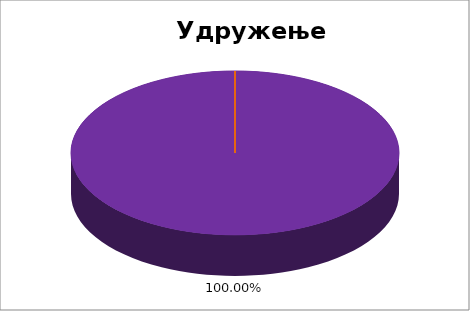
| Category | Удружење новинара |
|---|---|
| 0 | 0 |
| 1 | 0 |
| 2 | 0 |
| 3 | 0 |
| 4 | 1 |